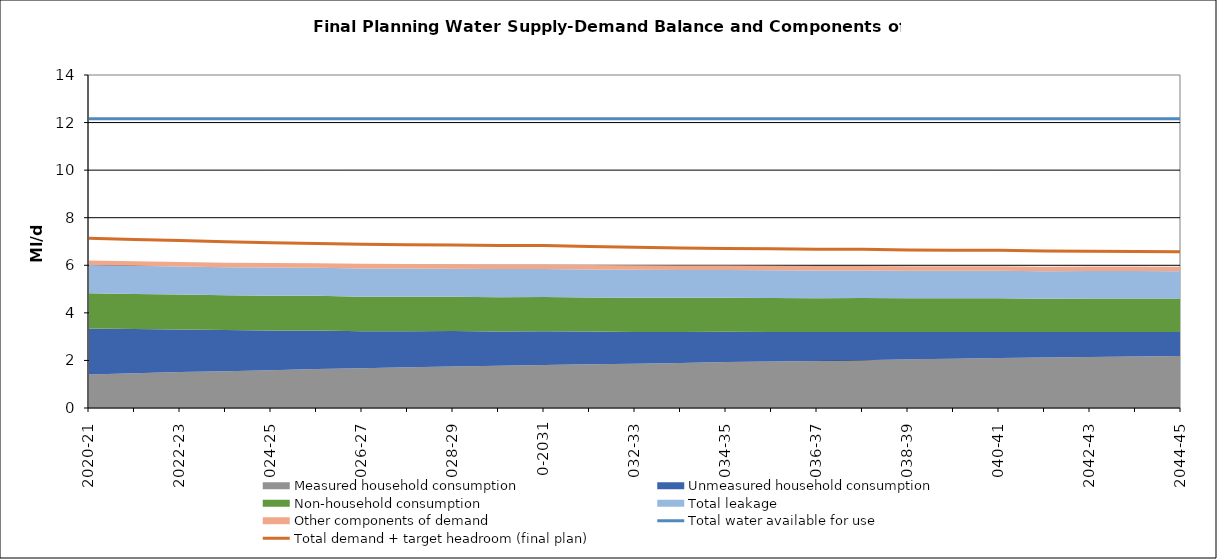
| Category | Total water available for use | Total demand + target headroom (final plan) |
|---|---|---|
| 0 | 12.16 | 7.14 |
| 1 | 12.16 | 7.08 |
| 2 | 12.16 | 7.04 |
| 3 | 12.16 | 6.99 |
| 4 | 12.16 | 6.95 |
| 5 | 12.16 | 6.92 |
| 6 | 12.16 | 6.88 |
| 7 | 12.16 | 6.86 |
| 8 | 12.16 | 6.85 |
| 9 | 12.16 | 6.83 |
| 10 | 12.16 | 6.83 |
| 11 | 12.16 | 6.79 |
| 12 | 12.16 | 6.76 |
| 13 | 12.16 | 6.73 |
| 14 | 12.16 | 6.71 |
| 15 | 12.16 | 6.69 |
| 16 | 12.16 | 6.67 |
| 17 | 12.16 | 6.67 |
| 18 | 12.16 | 6.64 |
| 19 | 12.16 | 6.63 |
| 20 | 12.16 | 6.63 |
| 21 | 12.16 | 6.6 |
| 22 | 12.16 | 6.59 |
| 23 | 12.16 | 6.58 |
| 24 | 12.16 | 6.57 |